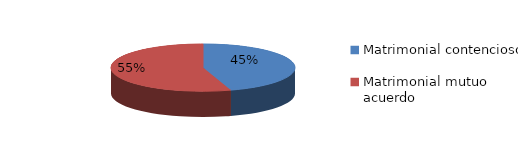
| Category | Series 0 |
|---|---|
| 0 | 872 |
| 1 | 1060 |